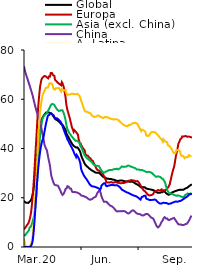
| Category | Global  | Europa | Asia (excl. China) | China | A. Latina | EE.UU. |
|---|---|---|---|---|---|---|
| 2020-03-01 | 18.777 | 7.173 | 4.771 | 73.431 | 3.271 | 0 |
| 2020-03-02 | 18.368 | 7.541 | 4.654 | 72.154 | 2.191 | 0 |
| 2020-03-03 | 18.098 | 7.825 | 4.802 | 71.105 | 0.719 | 0 |
| 2020-03-04 | 18.007 | 8.08 | 5.188 | 70.26 | 0.217 | 0 |
| 2020-03-05 | 18.004 | 8.511 | 5.572 | 69.493 | 0.214 | 0 |
| 2020-03-06 | 18.005 | 8.988 | 5.854 | 68.767 | 0.213 | 0 |
| 2020-03-07 | 17.959 | 9.265 | 6.129 | 68.024 | 0.213 | 0 |
| 2020-03-08 | 17.903 | 9.573 | 6.445 | 67.145 | 0.017 | 0 |
| 2020-03-09 | 18.063 | 9.938 | 6.871 | 66.39 | 0.332 | 0 |
| 2020-03-10 | 18.427 | 11.06 | 7.912 | 65.647 | 0.339 | 0.007 |
| 2020-03-11 | 18.568 | 12.156 | 8.077 | 64.799 | 0.447 | 0.007 |
| 2020-03-12 | 18.907 | 13.462 | 8.22 | 64.009 | 1.054 | 0.186 |
| 2020-03-13 | 19.469 | 15.283 | 8.619 | 63.178 | 1.687 | 0.768 |
| 2020-03-14 | 20.313 | 17.857 | 9.576 | 62.293 | 2.829 | 1.421 |
| 2020-03-15 | 21.39 | 20.82 | 10.534 | 61.505 | 4.492 | 2.487 |
| 2020-03-16 | 22.657 | 23.853 | 11.382 | 60.389 | 6.865 | 4.56 |
| 2020-03-17 | 24.246 | 27.616 | 11.743 | 59.294 | 10.352 | 7.4 |
| 2020-03-18 | 26.418 | 31.842 | 13.415 | 58.327 | 14.34 | 10.676 |
| 2020-03-19 | 28.787 | 36.154 | 15.6 | 57.263 | 18.592 | 14.521 |
| 2020-03-20 | 31.389 | 40.276 | 18.54 | 56.285 | 23.662 | 18.235 |
| 2020-03-21 | 34.057 | 44.591 | 21.272 | 55.391 | 29.014 | 21.9 |
| 2020-03-22 | 37.266 | 49.01 | 26.029 | 54.526 | 34.16 | 25.788 |
| 2020-03-23 | 40.058 | 53.624 | 29.809 | 53.924 | 38.951 | 29.184 |
| 2020-03-24 | 42.58 | 57.148 | 33.843 | 53.239 | 43.565 | 32.103 |
| 2020-03-25 | 45.041 | 60.196 | 38.274 | 52.469 | 47.986 | 34.775 |
| 2020-03-26 | 47.194 | 62.842 | 42.306 | 51.795 | 51.926 | 36.805 |
| 2020-03-27 | 49.011 | 65.204 | 45.498 | 51.142 | 54.972 | 38.659 |
| 2020-03-28 | 50.373 | 66.596 | 48.456 | 49.699 | 57.004 | 40.426 |
| 2020-03-29 | 51.066 | 67.88 | 49.258 | 48.304 | 58.76 | 41.675 |
| 2020-03-30 | 51.927 | 68.484 | 51.017 | 46.89 | 60.48 | 42.731 |
| 2020-03-31 | 52.603 | 68.803 | 52.267 | 45.6 | 61.622 | 43.511 |
| 2020-04-01 | 52.988 | 69.036 | 52.689 | 44.359 | 62.32 | 44.159 |
| 2020-04-02 | 53.42 | 69.258 | 53.139 | 43.099 | 62.848 | 45.353 |
| 2020-04-03 | 53.762 | 69.456 | 53.478 | 41.583 | 63.408 | 46.783 |
| 2020-04-04 | 54.135 | 69.55 | 53.717 | 40.861 | 63.966 | 48.123 |
| 2020-04-05 | 54.398 | 69.292 | 53.86 | 40.149 | 64.61 | 49.535 |
| 2020-04-06 | 54.604 | 69.11 | 54.094 | 39.827 | 64.65 | 50.667 |
| 2020-04-07 | 54.738 | 68.885 | 54.457 | 39.283 | 64.658 | 51.793 |
| 2020-04-08 | 54.65 | 68.668 | 54.828 | 37.838 | 64.656 | 52.868 |
| 2020-04-09 | 54.448 | 68.505 | 55.111 | 36.422 | 64.802 | 53.413 |
| 2020-04-10 | 54.611 | 69.216 | 55.85 | 35.261 | 66.091 | 53.718 |
| 2020-04-11 | 54.485 | 69.039 | 56.364 | 34.09 | 66.433 | 53.68 |
| 2020-04-12 | 54.478 | 69.216 | 56.926 | 32.77 | 66.505 | 54.213 |
| 2020-04-13 | 54.444 | 70.628 | 57.518 | 30.77 | 66.448 | 54.394 |
| 2020-04-14 | 54.111 | 70.667 | 57.868 | 29.01 | 66.419 | 54.299 |
| 2020-04-15 | 53.899 | 70.691 | 58.045 | 28.137 | 66.352 | 54.081 |
| 2020-04-16 | 53.683 | 70.648 | 58.227 | 27.331 | 66.064 | 53.839 |
| 2020-04-17 | 53.137 | 69.783 | 58.01 | 26.56 | 64.592 | 53.574 |
| 2020-04-18 | 52.877 | 69.813 | 57.897 | 25.847 | 64.135 | 53.428 |
| 2020-04-19 | 52.523 | 69.518 | 57.664 | 25.328 | 63.993 | 52.686 |
| 2020-04-20 | 52.043 | 67.913 | 57.118 | 25.221 | 63.942 | 52.349 |
| 2020-04-21 | 51.867 | 67.672 | 56.724 | 25.079 | 64.481 | 52.272 |
| 2020-04-22 | 51.698 | 67.423 | 56.363 | 25.066 | 64.468 | 52.294 |
| 2020-04-23 | 51.566 | 67.136 | 55.966 | 25.022 | 64.513 | 52.3 |
| 2020-04-24 | 51.443 | 66.853 | 55.69 | 24.968 | 64.541 | 52.177 |
| 2020-04-25 | 51.244 | 66.691 | 55.444 | 24.823 | 64.523 | 51.888 |
| 2020-04-26 | 50.954 | 66.392 | 55.241 | 24.339 | 64.578 | 51.694 |
| 2020-04-27 | 50.704 | 66.154 | 55.322 | 23.765 | 64.472 | 51.461 |
| 2020-04-28 | 50.472 | 66.059 | 55.339 | 23.285 | 63.776 | 51.182 |
| 2020-04-29 | 50.302 | 65.928 | 55.495 | 22.772 | 63.604 | 50.903 |
| 2020-04-30 | 49.923 | 65.674 | 55.545 | 22.049 | 63.132 | 50.54 |
| 2020-05-01 | 50.035 | 66.969 | 55.691 | 21.625 | 64.12 | 49.867 |
| 2020-05-02 | 49.683 | 66.554 | 55.536 | 21.155 | 64.034 | 49.217 |
| 2020-05-03 | 49.377 | 66.271 | 55.205 | 21.185 | 63.842 | 48.473 |
| 2020-05-04 | 48.915 | 65.049 | 54.396 | 21.584 | 63.632 | 47.75 |
| 2020-05-05 | 48.525 | 63.732 | 53.65 | 22.206 | 63.591 | 47.052 |
| 2020-05-06 | 48.018 | 62.312 | 52.681 | 22.749 | 63.603 | 46.367 |
| 2020-05-07 | 47.578 | 60.919 | 51.595 | 23.537 | 63.803 | 45.649 |
| 2020-05-08 | 46.509 | 58.342 | 50.058 | 23.775 | 62.496 | 45.126 |
| 2020-05-09 | 45.823 | 56.882 | 48.889 | 23.869 | 62.166 | 44.477 |
| 2020-05-10 | 45.352 | 55.642 | 47.893 | 24.694 | 61.767 | 43.732 |
| 2020-05-11 | 45.056 | 54.836 | 47.358 | 24.933 | 61.93 | 43.357 |
| 2020-05-12 | 44.485 | 53.88 | 46.804 | 24.516 | 61.878 | 42.869 |
| 2020-05-13 | 43.955 | 53 | 46.244 | 24.158 | 61.908 | 42.264 |
| 2020-05-14 | 43.509 | 52.185 | 45.891 | 23.733 | 61.945 | 41.799 |
| 2020-05-15 | 43.055 | 50.981 | 45.659 | 23.473 | 61.996 | 41.305 |
| 2020-05-16 | 42.718 | 50.094 | 45.326 | 23.66 | 62.116 | 40.865 |
| 2020-05-17 | 42.144 | 48.831 | 44.926 | 22.864 | 62.419 | 40.48 |
| 2020-05-18 | 41.712 | 48.155 | 44.616 | 22.382 | 62.265 | 39.875 |
| 2020-05-19 | 41.45 | 47.521 | 44.317 | 22.329 | 62.18 | 39.311 |
| 2020-05-20 | 41.092 | 46.81 | 43.931 | 22.27 | 62.083 | 38.76 |
| 2020-05-21 | 40.942 | 47.494 | 43.665 | 22.242 | 62.105 | 38.062 |
| 2020-05-22 | 40.729 | 47.338 | 43.402 | 22.337 | 62.088 | 37.535 |
| 2020-05-23 | 40.516 | 46.943 | 43.131 | 22.24 | 62.006 | 37.054 |
| 2020-05-24 | 40.396 | 46.538 | 43.082 | 22.199 | 61.998 | 36.542 |
| 2020-05-25 | 40.611 | 46.348 | 43.162 | 22.24 | 62.354 | 37.381 |
| 2020-05-26 | 40.462 | 45.953 | 43.021 | 22.082 | 62.233 | 37.084 |
| 2020-05-27 | 40.279 | 45.629 | 42.895 | 21.958 | 62.089 | 36.618 |
| 2020-05-28 | 39.866 | 43.955 | 42.687 | 21.845 | 61.806 | 36.111 |
| 2020-05-29 | 39.551 | 43.11 | 42.434 | 21.695 | 61.526 | 35.572 |
| 2020-05-30 | 39.017 | 42.153 | 42.092 | 21.564 | 61.179 | 34.696 |
| 2020-05-31 | 38.389 | 41.207 | 41.682 | 21.353 | 60.806 | 33.86 |
| 2020-06-01 | 37.393 | 41.647 | 40.836 | 20.955 | 59.567 | 31.832 |
| 2020-06-02 | 36.625 | 41.083 | 40.108 | 20.87 | 58.849 | 31.035 |
| 2020-06-03 | 36.013 | 40.57 | 39.528 | 20.802 | 58.113 | 30.406 |
| 2020-06-04 | 35.446 | 40.247 | 38.899 | 20.733 | 57.397 | 29.897 |
| 2020-06-05 | 34.888 | 39.851 | 38.309 | 20.693 | 56.671 | 29.347 |
| 2020-06-06 | 34.335 | 39.474 | 37.73 | 20.516 | 55.94 | 28.942 |
| 2020-06-07 | 33.825 | 39.298 | 37.149 | 20.421 | 55.261 | 28.498 |
| 2020-06-08 | 33.408 | 37.75 | 36.786 | 20.428 | 55.088 | 28.189 |
| 2020-06-09 | 33.155 | 37.485 | 36.561 | 20.273 | 54.912 | 27.841 |
| 2020-06-10 | 32.859 | 37.24 | 36.228 | 20.095 | 54.654 | 27.48 |
| 2020-06-11 | 32.686 | 37.348 | 35.969 | 19.906 | 54.968 | 27.108 |
| 2020-06-12 | 32.442 | 37.062 | 35.688 | 19.655 | 54.747 | 26.718 |
| 2020-06-13 | 32.201 | 36.77 | 35.565 | 19.489 | 54.549 | 26.258 |
| 2020-06-14 | 31.943 | 36.372 | 35.43 | 19.317 | 54.37 | 25.797 |
| 2020-06-15 | 31.753 | 36.208 | 35.205 | 19.218 | 54.48 | 25.487 |
| 2020-06-16 | 31.556 | 36.021 | 34.932 | 19.245 | 54.201 | 25.175 |
| 2020-06-17 | 31.424 | 35.897 | 34.734 | 19.278 | 54.097 | 24.949 |
| 2020-06-18 | 31.173 | 35.251 | 34.524 | 19.331 | 53.456 | 24.726 |
| 2020-06-19 | 31.021 | 35.151 | 34.293 | 19.494 | 53.355 | 24.6 |
| 2020-06-20 | 30.885 | 34.961 | 33.835 | 19.718 | 53.179 | 24.545 |
| 2020-06-21 | 30.719 | 34.393 | 33.605 | 19.96 | 52.868 | 24.514 |
| 2020-06-22 | 30.585 | 33.884 | 33.422 | 20.141 | 52.788 | 24.534 |
| 2020-06-23 | 30.406 | 33.325 | 33.248 | 20.211 | 52.861 | 24.465 |
| 2020-06-24 | 30.263 | 32.856 | 33.082 | 20.206 | 52.917 | 24.366 |
| 2020-06-25 | 30.142 | 32.301 | 33.014 | 20.527 | 52.926 | 24.244 |
| 2020-06-26 | 30.118 | 31.729 | 32.967 | 21.147 | 53 | 24.178 |
| 2020-06-27 | 30.176 | 31.394 | 33.038 | 21.812 | 53.187 | 24.136 |
| 2020-06-28 | 30.18 | 31.217 | 32.963 | 22.177 | 53.442 | 23.975 |
| 2020-06-29 | 30.171 | 31.124 | 32.905 | 22.51 | 53.46 | 23.823 |
| 2020-06-30 | 30.101 | 30.995 | 32.782 | 22.734 | 53.294 | 23.731 |
| 2020-07-01 | 29.974 | 30.81 | 32.399 | 23.082 | 53.069 | 23.524 |
| 2020-07-02 | 29.682 | 30.693 | 31.889 | 22.731 | 52.86 | 23.336 |
| 2020-07-03 | 29.38 | 30.564 | 31.449 | 21.698 | 52.821 | 23.813 |
| 2020-07-04 | 29.121 | 30.283 | 31.056 | 20.526 | 52.736 | 24.909 |
| 2020-07-05 | 28.887 | 30.019 | 30.745 | 19.916 | 52.616 | 25.315 |
| 2020-07-06 | 28.647 | 29.734 | 30.477 | 19.356 | 52.353 | 25.457 |
| 2020-07-07 | 28.456 | 29.331 | 30.228 | 18.861 | 52.443 | 25.596 |
| 2020-07-08 | 28.275 | 28.782 | 30.206 | 18.338 | 52.534 | 25.873 |
| 2020-07-09 | 28.24 | 28.27 | 30.242 | 18.183 | 52.821 | 26.178 |
| 2020-07-10 | 28.191 | 27.744 | 30.413 | 18.337 | 52.853 | 25.91 |
| 2020-07-11 | 28.021 | 27.144 | 30.593 | 18.557 | 52.771 | 24.929 |
| 2020-07-12 | 27.848 | 26.296 | 30.764 | 18.357 | 52.698 | 24.709 |
| 2020-07-13 | 27.725 | 25.938 | 30.804 | 18.084 | 52.687 | 24.67 |
| 2020-07-14 | 27.746 | 26.203 | 30.95 | 17.84 | 52.69 | 24.765 |
| 2020-07-15 | 27.729 | 26.17 | 31.127 | 17.571 | 52.605 | 24.921 |
| 2020-07-16 | 27.692 | 26.205 | 31.242 | 17.3 | 52.403 | 24.978 |
| 2020-07-17 | 27.626 | 26.238 | 31.226 | 17.068 | 52.234 | 24.976 |
| 2020-07-18 | 27.571 | 26.257 | 31.241 | 16.815 | 52.167 | 25.058 |
| 2020-07-19 | 27.565 | 26.297 | 31.286 | 16.687 | 52.038 | 25.164 |
| 2020-07-20 | 27.572 | 26.356 | 31.317 | 16.61 | 52.019 | 25.232 |
| 2020-07-21 | 27.494 | 26.042 | 31.31 | 16.507 | 51.913 | 25.205 |
| 2020-07-22 | 27.392 | 26.095 | 31.204 | 16.301 | 51.858 | 25.147 |
| 2020-07-23 | 27.385 | 26.094 | 31.473 | 16.075 | 51.777 | 25.139 |
| 2020-07-24 | 27.33 | 26.159 | 31.633 | 15.768 | 51.788 | 25.116 |
| 2020-07-25 | 27.245 | 26.233 | 31.69 | 15.462 | 51.798 | 25.079 |
| 2020-07-26 | 27.147 | 26.387 | 31.637 | 15.177 | 51.878 | 25.042 |
| 2020-07-27 | 27.032 | 26.358 | 31.626 | 14.864 | 51.809 | 25.043 |
| 2020-07-28 | 26.926 | 26.285 | 31.681 | 14.574 | 51.835 | 25.076 |
| 2020-07-29 | 26.892 | 26.178 | 31.816 | 14.508 | 51.861 | 25.079 |
| 2020-07-30 | 26.777 | 26.077 | 31.45 | 14.453 | 51.807 | 25.074 |
| 2020-07-31 | 26.811 | 26.042 | 31.53 | 14.469 | 51.637 | 24.797 |
| 2020-08-01 | 26.893 | 26.037 | 31.744 | 14.489 | 51.401 | 24.583 |
| 2020-08-02 | 26.894 | 25.936 | 31.806 | 14.494 | 51.149 | 24.417 |
| 2020-08-03 | 26.985 | 25.863 | 32.11 | 14.54 | 50.881 | 24.118 |
| 2020-08-04 | 27.024 | 25.825 | 32.261 | 14.614 | 50.595 | 23.915 |
| 2020-08-05 | 27.036 | 25.842 | 32.458 | 14.572 | 50.304 | 23.556 |
| 2020-08-06 | 27.037 | 25.909 | 32.727 | 14.564 | 50.049 | 23.233 |
| 2020-08-07 | 26.951 | 25.989 | 32.597 | 14.56 | 49.933 | 23.154 |
| 2020-08-08 | 26.855 | 26.002 | 32.527 | 14.595 | 49.698 | 23.013 |
| 2020-08-09 | 26.801 | 25.96 | 32.571 | 14.616 | 49.489 | 22.8 |
| 2020-08-10 | 26.726 | 26.036 | 32.578 | 14.554 | 49.366 | 22.718 |
| 2020-08-11 | 26.666 | 26.178 | 32.544 | 14.454 | 49.262 | 22.489 |
| 2020-08-12 | 26.651 | 26.312 | 32.596 | 14.297 | 49.237 | 22.425 |
| 2020-08-13 | 26.628 | 26.346 | 32.733 | 14.113 | 49.208 | 22.315 |
| 2020-08-14 | 26.555 | 26.368 | 32.839 | 13.916 | 49.034 | 22.172 |
| 2020-08-15 | 26.605 | 26.808 | 33.058 | 13.71 | 49.048 | 22.074 |
| 2020-08-16 | 26.555 | 26.812 | 33.102 | 13.572 | 49.155 | 22 |
| 2020-08-17 | 26.554 | 26.905 | 33.055 | 13.633 | 49.502 | 21.878 |
| 2020-08-18 | 26.512 | 26.889 | 32.955 | 13.751 | 49.507 | 21.736 |
| 2020-08-19 | 26.484 | 26.949 | 32.737 | 13.983 | 49.501 | 21.627 |
| 2020-08-20 | 26.54 | 27.088 | 32.682 | 14.243 | 49.638 | 21.51 |
| 2020-08-21 | 26.565 | 27.211 | 32.66 | 14.5 | 49.881 | 21.402 |
| 2020-08-22 | 26.479 | 26.921 | 32.535 | 14.738 | 50.065 | 21.249 |
| 2020-08-23 | 26.466 | 27.023 | 32.534 | 14.879 | 50.209 | 21.096 |
| 2020-08-24 | 26.329 | 26.986 | 32.295 | 14.901 | 50.075 | 20.99 |
| 2020-08-25 | 26.245 | 27.021 | 32.216 | 14.807 | 50.298 | 20.955 |
| 2020-08-26 | 26.114 | 26.956 | 32.185 | 14.601 | 50.47 | 20.83 |
| 2020-08-27 | 25.921 | 26.834 | 32.066 | 14.359 | 50.485 | 20.771 |
| 2020-08-28 | 25.742 | 26.654 | 31.898 | 14.098 | 50.379 | 20.667 |
| 2020-08-29 | 25.583 | 26.653 | 31.622 | 13.853 | 50.281 | 20.61 |
| 2020-08-30 | 25.464 | 26.884 | 31.477 | 13.661 | 50.155 | 20.434 |
| 2020-08-31 | 25.345 | 26.801 | 31.504 | 13.488 | 49.936 | 20.28 |
| 2020-09-01 | 25.145 | 26.504 | 31.477 | 13.431 | 49.452 | 20.051 |
| 2020-09-02 | 25.021 | 26.284 | 31.52 | 13.411 | 49.01 | 19.94 |
| 2020-09-03 | 24.82 | 26.062 | 31.404 | 13.37 | 48.515 | 19.648 |
| 2020-09-04 | 24.593 | 25.495 | 31.359 | 13.313 | 48.019 | 19.391 |
| 2020-09-05 | 24.372 | 25.062 | 31.218 | 13.203 | 47.473 | 19.253 |
| 2020-09-06 | 24.215 | 24.588 | 31.152 | 13.052 | 47.056 | 19.258 |
| 2020-09-07 | 24.388 | 24.111 | 31.294 | 12.915 | 47.664 | 20.308 |
| 2020-09-08 | 24.338 | 23.78 | 31.216 | 12.814 | 47.605 | 20.426 |
| 2020-09-09 | 24.258 | 23.405 | 31.059 | 12.797 | 47.501 | 20.497 |
| 2020-09-10 | 24.237 | 22.99 | 30.957 | 12.848 | 47.431 | 20.698 |
| 2020-09-11 | 24.238 | 22.852 | 30.919 | 12.959 | 47.224 | 20.827 |
| 2020-09-12 | 24.243 | 22.67 | 30.883 | 13.19 | 46.988 | 20.812 |
| 2020-09-13 | 24.171 | 22.408 | 30.623 | 13.343 | 46.654 | 20.821 |
| 2020-09-14 | 23.771 | 22.076 | 30.366 | 13.446 | 45.367 | 19.703 |
| 2020-09-15 | 23.698 | 21.754 | 30.386 | 13.529 | 44.976 | 19.545 |
| 2020-09-16 | 23.628 | 21.492 | 30.389 | 13.42 | 45.111 | 19.435 |
| 2020-09-17 | 23.573 | 21.291 | 30.522 | 13.262 | 44.877 | 19.361 |
| 2020-09-18 | 23.527 | 21.048 | 30.541 | 13.073 | 45.174 | 19.278 |
| 2020-09-19 | 23.44 | 20.969 | 30.507 | 12.716 | 45.459 | 19.147 |
| 2020-09-20 | 23.411 | 20.945 | 30.513 | 12.558 | 45.687 | 19.039 |
| 2020-09-21 | 23.349 | 21.048 | 30.349 | 12.289 | 46.05 | 19.061 |
| 2020-09-22 | 23.315 | 21.094 | 30.312 | 11.942 | 46.583 | 19.13 |
| 2020-09-23 | 23.25 | 21.139 | 30.123 | 11.873 | 46.469 | 19.128 |
| 2020-09-24 | 23.186 | 21.222 | 29.846 | 11.761 | 46.756 | 19.125 |
| 2020-09-25 | 23.112 | 21.334 | 29.63 | 11.664 | 46.678 | 19.147 |
| 2020-09-26 | 23.025 | 21.703 | 29.38 | 11.341 | 46.648 | 19.216 |
| 2020-09-27 | 22.921 | 22.431 | 29.14 | 10.71 | 46.598 | 19.237 |
| 2020-09-28 | 22.789 | 22.538 | 28.967 | 10.128 | 46.614 | 19.265 |
| 2020-09-29 | 22.608 | 22.735 | 28.64 | 9.668 | 46.395 | 19.184 |
| 2020-09-30 | 22.375 | 22.742 | 28.478 | 9.022 | 46.216 | 19.028 |
| 2020-10-01 | 22.182 | 22.686 | 28.508 | 8.506 | 45.975 | 18.718 |
| 2020-10-02 | 22.077 | 22.676 | 28.715 | 8.117 | 45.652 | 18.45 |
| 2020-10-03 | 22.042 | 23.126 | 28.702 | 7.95 | 45.365 | 18.206 |
| 2020-10-04 | 21.985 | 22.999 | 28.6 | 8.029 | 45.122 | 18.034 |
| 2020-10-05 | 21.967 | 22.95 | 28.577 | 8.311 | 44.787 | 17.778 |
| 2020-10-06 | 21.999 | 22.948 | 28.533 | 8.617 | 44.47 | 17.632 |
| 2020-10-07 | 22.113 | 23.084 | 28.444 | 9.12 | 44.286 | 17.587 |
| 2020-10-08 | 22.228 | 23.271 | 28.158 | 9.775 | 43.99 | 17.625 |
| 2020-10-09 | 22.262 | 23.387 | 27.833 | 10.181 | 43.776 | 17.665 |
| 2020-10-10 | 22.254 | 22.711 | 27.833 | 10.507 | 43.296 | 17.749 |
| 2020-10-11 | 22.334 | 22.771 | 27.722 | 10.961 | 42.787 | 17.771 |
| 2020-10-12 | 22.562 | 23.05 | 27.234 | 11.658 | 43.781 | 17.99 |
| 2020-10-13 | 22.564 | 22.997 | 26.953 | 12.026 | 43.464 | 18.019 |
| 2020-10-14 | 22.462 | 23.073 | 26.541 | 12.121 | 43.092 | 17.903 |
| 2020-10-15 | 22.168 | 23.138 | 25.751 | 11.809 | 42.877 | 17.857 |
| 2020-10-16 | 21.891 | 23.157 | 24.809 | 11.546 | 42.682 | 17.886 |
| 2020-10-17 | 21.726 | 23.476 | 23.934 | 11.637 | 42.649 | 17.776 |
| 2020-10-18 | 21.563 | 23.679 | 23.152 | 11.591 | 42.554 | 17.728 |
| 2020-10-19 | 21.277 | 23.879 | 22.782 | 11.161 | 41.268 | 17.538 |
| 2020-10-20 | 21.208 | 24.437 | 22.245 | 10.966 | 41.222 | 17.49 |
| 2020-10-21 | 21.204 | 24.814 | 21.826 | 10.904 | 41.142 | 17.561 |
| 2020-10-22 | 21.362 | 25.372 | 21.78 | 11.015 | 41.044 | 17.585 |
| 2020-10-23 | 21.588 | 26.53 | 21.813 | 11.17 | 40.615 | 17.571 |
| 2020-10-24 | 21.789 | 27.58 | 21.711 | 11.319 | 40.249 | 17.675 |
| 2020-10-25 | 21.976 | 28.771 | 21.571 | 11.413 | 39.855 | 17.851 |
| 2020-10-26 | 22.168 | 29.851 | 21.555 | 11.52 | 39.322 | 17.945 |
| 2020-10-27 | 22.277 | 30.81 | 21.385 | 11.611 | 38.853 | 18.014 |
| 2020-10-28 | 22.371 | 31.737 | 21.222 | 11.685 | 38.468 | 18.117 |
| 2020-10-29 | 22.504 | 32.4 | 21.182 | 11.788 | 38.083 | 18.32 |
| 2020-10-30 | 22.598 | 33.762 | 21.105 | 11.535 | 38.081 | 18.338 |
| 2020-10-31 | 22.663 | 35.376 | 20.977 | 11.082 | 38.054 | 18.38 |
| 2020-11-01 | 22.786 | 36.86 | 20.962 | 10.674 | 38.123 | 18.469 |
| 2020-11-02 | 22.868 | 38.058 | 20.786 | 10.286 | 39.477 | 18.455 |
| 2020-11-03 | 22.94 | 39.203 | 20.974 | 9.951 | 39.45 | 18.393 |
| 2020-11-04 | 23.069 | 40.418 | 20.998 | 9.599 | 39.382 | 18.488 |
| 2020-11-05 | 23.12 | 41.963 | 20.926 | 9.199 | 39.325 | 18.46 |
| 2020-11-06 | 23.143 | 42.361 | 20.822 | 9.157 | 39.184 | 18.576 |
| 2020-11-07 | 23.211 | 42.93 | 20.756 | 9.164 | 38.985 | 18.691 |
| 2020-11-08 | 23.249 | 43.696 | 20.651 | 9.152 | 38.721 | 18.659 |
| 2020-11-09 | 23.194 | 43.857 | 20.648 | 9.146 | 37.214 | 18.74 |
| 2020-11-10 | 23.187 | 44.128 | 20.436 | 9.003 | 37.111 | 18.893 |
| 2020-11-11 | 23.273 | 44.877 | 20.329 | 8.904 | 37.051 | 19.098 |
| 2020-11-12 | 23.274 | 44.894 | 20.204 | 8.874 | 36.992 | 19.28 |
| 2020-11-13 | 23.26 | 44.844 | 20.046 | 8.91 | 36.912 | 19.413 |
| 2020-11-14 | 23.4 | 44.82 | 20.437 | 8.982 | 36.793 | 19.565 |
| 2020-11-15 | 23.54 | 44.99 | 20.798 | 9.093 | 36.049 | 19.77 |
| 2020-11-16 | 23.708 | 45.057 | 21.08 | 9.174 | 36.435 | 19.88 |
| 2020-11-17 | 23.859 | 45.092 | 21.202 | 9.315 | 36.452 | 20.13 |
| 2020-11-18 | 23.889 | 44.705 | 21.339 | 9.404 | 36.467 | 20.272 |
| 2020-11-19 | 24.031 | 44.763 | 21.519 | 9.481 | 36.456 | 20.461 |
| 2020-11-20 | 24.28 | 44.807 | 21.751 | 9.885 | 36.645 | 20.672 |
| 2020-11-21 | 24.404 | 44.853 | 21.536 | 10.26 | 36.693 | 20.864 |
| 2020-11-22 | 24.619 | 44.858 | 21.397 | 10.67 | 37.277 | 21.161 |
| 2020-11-23 | 24.83 | 44.779 | 21.488 | 11.128 | 37.024 | 21.508 |
| 2020-11-24 | 25.019 | 44.738 | 21.61 | 11.629 | 36.994 | 21.597 |
| 2020-11-25 | 25.165 | 44.644 | 21.783 | 12.199 | 36.89 | 21.408 |
| 2020-11-26 | 25.373 | 44.515 | 21.994 | 12.765 | 36.831 | 21.552 |
| 2020-11-27 | 25.436 | 44.346 | 22.115 | 12.965 | 36.508 | 21.685 |